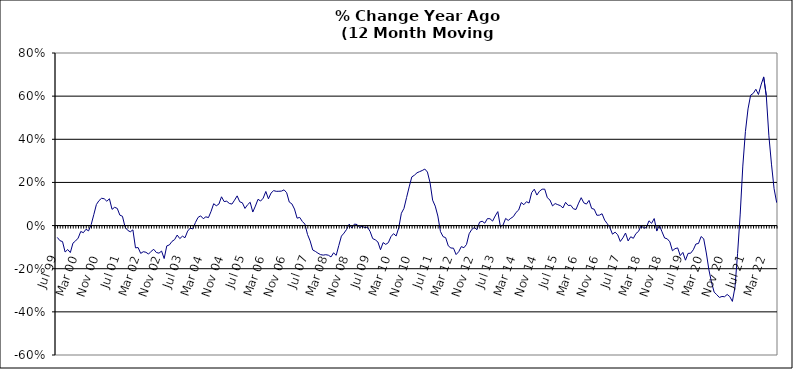
| Category | Series 0 |
|---|---|
| Jul 99 | -0.055 |
| Aug 99 | -0.07 |
| Sep 99 | -0.074 |
| Oct 99 | -0.123 |
| Nov 99 | -0.111 |
| Dec 99 | -0.125 |
| Jan 00 | -0.082 |
| Feb 00 | -0.071 |
| Mar 00 | -0.058 |
| Apr 00 | -0.027 |
| May 00 | -0.033 |
| Jun 00 | -0.017 |
| Jul 00 | -0.025 |
| Aug 00 | 0.005 |
| Sep 00 | 0.05 |
| Oct 00 | 0.098 |
| Nov 00 | 0.116 |
| Dec 00 | 0.127 |
| Jan 01 | 0.124 |
| Feb 01 | 0.113 |
| Mar 01 | 0.124 |
| Apr 01 | 0.075 |
| May 01 | 0.085 |
| Jun 01 | 0.08 |
| Jul 01 | 0.048 |
| Aug 01 | 0.043 |
| Sep 01 | -0.007 |
| Oct 01 | -0.022 |
| Nov 01 | -0.029 |
| Dec 01 | -0.02 |
| Jan 02 | -0.103 |
| Feb 02 | -0.102 |
| Mar 02 | -0.129 |
| Apr 02 | -0.121 |
| May 02 | -0.124 |
| Jun 02 | -0.132 |
| Jul 02 | -0.119 |
| Aug 02 | -0.11 |
| Sep 02 | -0.125 |
| Oct 02 | -0.128 |
| Nov 02 | -0.118 |
| Dec 02 | -0.153 |
| Jan 03 | -0.094 |
| Feb 03 | -0.09 |
| Mar 03 | -0.073 |
| Apr 03 | -0.065 |
| May 03 | -0.044 |
| Jun 03 | -0.06 |
| Jul 03 | -0.049 |
| Aug 03 | -0.056 |
| Sep 03 | -0.026 |
| Oct 03 | -0.012 |
| Nov 03 | -0.016 |
| Dec 03 | 0.014 |
| Jan 04 | 0.038 |
| Feb 04 | 0.045 |
| Mar 04 | 0.032 |
| Apr 04 | 0.041 |
| May 04 | 0.037 |
| Jun 04 | 0.066 |
| Jul 04 | 0.101 |
| Aug 04 | 0.092 |
| Sep 04 | 0.1 |
| Oct 04 | 0.133 |
| Nov 04 | 0.111 |
| Dec 04 | 0.113 |
| Jan 05 | 0.103 |
| Feb 05 | 0.1 |
| Mar 05 | 0.118 |
| Apr 05 | 0.138 |
| May 05 | 0.11 |
| Jun 05 | 0.106 |
| Jul 05 | 0.079 |
| Aug 05 | 0.097 |
| Sep 05 | 0.108 |
| Oct 05 | 0.063 |
| Nov 05 | 0.09 |
| Dec 05 | 0.122 |
| Jan 06 | 0.114 |
| Feb 06 | 0.127 |
| Mar 06 | 0.158 |
| Apr 06 | 0.124 |
| May 06 | 0.151 |
| Jun 06 | 0.162 |
| Jul 06 | 0.159 |
| Aug 06 | 0.159 |
| Sep 06 | 0.16 |
| Oct 06 | 0.166 |
| Nov 06 | 0.152 |
| Dec 06 | 0.109 |
| Jan 07 | 0.101 |
| Feb 07 | 0.076 |
| Mar 07 | 0.034 |
| Apr 07 | 0.038 |
| May 07 | 0.019 |
| Jun 07 | 0.007 |
| Jul 07 | -0.041 |
| Aug 07 | -0.071 |
| Sep 07 | -0.113 |
| Oct 07 | -0.12 |
| Nov 07 | -0.128 |
| Dec 07 | -0.135 |
| Jan 08 | -0.137 |
| Feb 08 | -0.135 |
| Mar 08 | -0.137 |
| Apr 08 | -0.145 |
| May 08 | -0.126 |
| Jun 08 | -0.138 |
| Jul 08 | -0.093 |
| Aug 08 | -0.049 |
| Sep-08 | -0.035 |
| Oct 08 | -0.018 |
| Nov 08 | 0.007 |
| Dec 08 | -0.011 |
| Jan 09 | 0.007 |
| Feb 09 | 0.005 |
| Mar 09 | -0.009 |
| Apr 09 | -0.003 |
| May 09 | -0.01 |
| Jun 09 | -0.007 |
| Jul 09 | -0.027 |
| Aug 09 | -0.06 |
| Sep 09 | -0.066 |
| Oct 09 | -0.076 |
| Nov 09 | -0.112 |
| Dec 09 | -0.079 |
| Jan 10 | -0.087 |
| Feb 10 | -0.079 |
| Mar 10 | -0.052 |
| Apr 10 | -0.037 |
| May 10 | -0.048 |
| Jun 10 | -0.01 |
| Jul 10 | 0.057 |
| Aug 10 | 0.08 |
| Sep 10 | 0.13 |
| Oct 10 | 0.179 |
| Nov 10 | 0.226 |
| Dec 10 | 0.233 |
| Jan 11 | 0.245 |
| Feb 11 | 0.25 |
| Mar 11 | 0.255 |
| Apr 11 | 0.262 |
| May 11 | 0.248 |
| Jun 11 | 0.199 |
| Jul 11 | 0.118 |
| Aug 11 | 0.09 |
| Sep 11 | 0.044 |
| Oct 11 | -0.028 |
| Nov 11 | -0.051 |
| Dec 11 | -0.056 |
| Jan 12 | -0.094 |
| Feb 12 | -0.104 |
| Mar 12 | -0.105 |
| Apr 12 | -0.134 |
| May 12 | -0.121 |
| Jun 12 | -0.098 |
| Jul 12 | -0.103 |
| Aug 12 | -0.087 |
| Sep 12 | -0.038 |
| Oct 12 | -0.018 |
| Nov 12 | -0.009 |
| Dec 12 | -0.019 |
| Jan 13 | 0.016 |
| Feb-13 | 0.02 |
| Mar-13 | 0.011 |
| Apr 13 | 0.032 |
| May 13 | 0.032 |
| Jun-13 | 0.021 |
| Jul 13 | 0.045 |
| Aug 13 | 0.065 |
| Sep 13 | -0.005 |
| Oct 13 | 0.002 |
| Nov 13 | 0.033 |
| Dec 13 | 0.024 |
| Jan 14 | 0.034 |
| Feb-14 | 0.042 |
| Mar 14 | 0.061 |
| Apr 14 | 0.072 |
| May 14 | 0.107 |
| Jun 14 | 0.097 |
| Jul-14 | 0.111 |
| Aug-14 | 0.105 |
| Sep 14 | 0.153 |
| Oct 14 | 0.169 |
| Nov 14 | 0.141 |
| Dec 14 | 0.159 |
| Jan 15 | 0.169 |
| Feb 15 | 0.169 |
| Mar 15 | 0.129 |
| Apr-15 | 0.118 |
| May 15 | 0.091 |
| Jun-15 | 0.102 |
| Jul 15 | 0.097 |
| Aug 15 | 0.092 |
| Sep 15 | 0.082 |
| Oct 15 | 0.108 |
| Nov 15 | 0.093 |
| Dec 15 | 0.094 |
| Jan 16 | 0.078 |
| Feb 16 | 0.075 |
| Mar 16 | 0.104 |
| Apr 16 | 0.129 |
| May 16 | 0.105 |
| Jun 16 | 0.1 |
| Jul 16 | 0.117 |
| Aug 16 | 0.08 |
| Sep 16 | 0.076 |
| Oct 16 | 0.048 |
| Nov 16 | 0.048 |
| Dec 16 | 0.055 |
| Jan 17 | 0.025 |
| Feb 17 | 0.009 |
| Mar 17 | -0.01 |
| Apr 17 | -0.04 |
| May 17 | -0.031 |
| Jun 17 | -0.042 |
| Jul 17 | -0.074 |
| Aug 17 | -0.057 |
| Sep 17 | -0.035 |
| Oct 17 | -0.071 |
| Nov 17 | -0.052 |
| Dec 17 | -0.059 |
| Jan 18 | -0.037 |
| Feb 18 | -0.027 |
| Mar 18 | 0 |
| Apr 18 | -0.012 |
| May 18 | -0.009 |
| Jun 18 | 0.022 |
| Jul 18 | 0.01 |
| Aug 18 | 0.033 |
| Sep 18 | -0.025 |
| Oct 18 | 0.002 |
| Nov 18 | -0.029 |
| Dec 18 | -0.058 |
| Jan 19 | -0.061 |
| Feb 19 | -0.075 |
| Mar 19 | -0.117 |
| Apr 19 | -0.107 |
| May 19 | -0.104 |
| Jun 19 | -0.139 |
| Jul 19 | -0.124 |
| Aug 19 | -0.16 |
| Sep 19 | -0.129 |
| Oct 19 | -0.128 |
| Nov 19 | -0.112 |
| Dec 19 | -0.085 |
| Jan 20 | -0.083 |
| Feb 20 | -0.051 |
| Mar 20 | -0.061 |
| Apr 20 | -0.127 |
| May 20 | -0.206 |
| Jun 20 | -0.264 |
| Jul 20 | -0.308 |
| Aug 20 | -0.32 |
| Sep 20 | -0.333 |
| Oct 20 | -0.329 |
| Nov 20 | -0.33 |
| Dec 20 | -0.319 |
| Jan 21 | -0.329 |
| Feb 21 | -0.352 |
| Mar 21 | -0.286 |
| Apr 21 | -0.129 |
| May 21 | 0.053 |
| Jun 21 | 0.276 |
| Jul 21 | 0.435 |
| Aug 21 | 0.541 |
| Sep 21 | 0.604 |
| Oct 21 | 0.613 |
| Nov 21 | 0.632 |
| Dec 21 | 0.608 |
| Jan 22 | 0.652 |
| Feb 22 | 0.689 |
| Mar 22 | 0.603 |
| Apr 22 | 0.416 |
| May 22 | 0.285 |
| Jun 22 | 0.171 |
| Jul 22 | 0.106 |